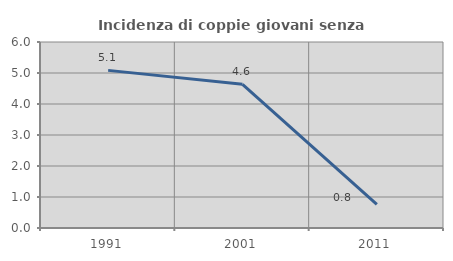
| Category | Incidenza di coppie giovani senza figli |
|---|---|
| 1991.0 | 5.085 |
| 2001.0 | 4.636 |
| 2011.0 | 0.763 |